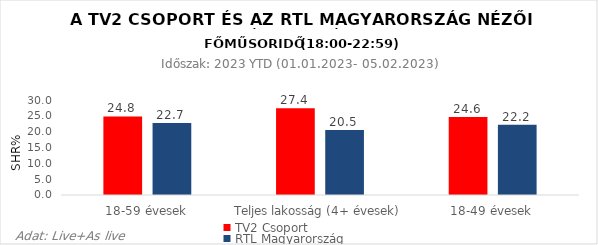
| Category | TV2 Csoport | RTL Magyarország |
|---|---|---|
| 18-59 évesek | 24.8 | 22.7 |
| Teljes lakosság (4+ évesek) | 27.4 | 20.5 |
| 18-49 évesek | 24.6 | 22.2 |